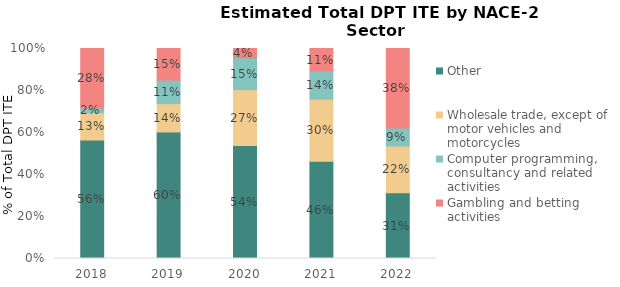
| Category | Other | Wholesale trade, except of motor vehicles and motorcycles | Computer programming, consultancy and related activities | Gambling and betting activities |
|---|---|---|---|---|
| 2018.0 | 0.564 | 0.13 | 0.023 | 0.283 |
| 2019.0 | 0.602 | 0.135 | 0.112 | 0.151 |
| 2020.0 | 0.538 | 0.266 | 0.152 | 0.044 |
| 2021.0 | 0.463 | 0.296 | 0.136 | 0.106 |
| 2022.0 | 0.313 | 0.222 | 0.086 | 0.378 |